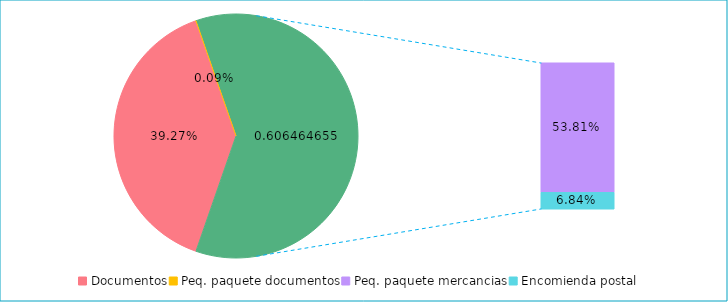
| Category | Series 0 |
|---|---|
| Documentos | 0.393 |
| Peq. paquete documentos | 0.001 |
| Peq. paquete mercancias | 0.538 |
| Encomienda postal | 0.068 |